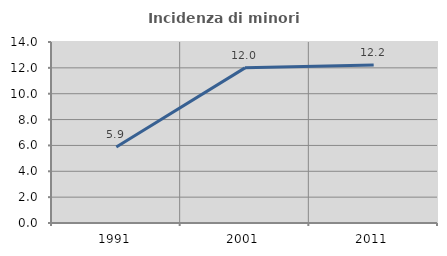
| Category | Incidenza di minori stranieri |
|---|---|
| 1991.0 | 5.882 |
| 2001.0 | 12 |
| 2011.0 | 12.217 |